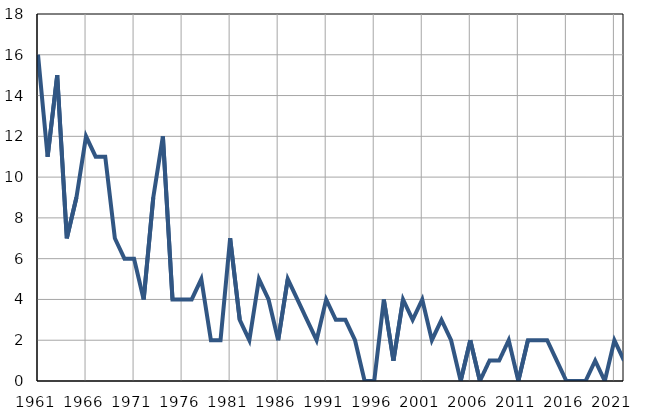
| Category | Infants
deaths |
|---|---|
| 1961.0 | 16 |
| 1962.0 | 11 |
| 1963.0 | 15 |
| 1964.0 | 7 |
| 1965.0 | 9 |
| 1966.0 | 12 |
| 1967.0 | 11 |
| 1968.0 | 11 |
| 1969.0 | 7 |
| 1970.0 | 6 |
| 1971.0 | 6 |
| 1972.0 | 4 |
| 1973.0 | 9 |
| 1974.0 | 12 |
| 1975.0 | 4 |
| 1976.0 | 4 |
| 1977.0 | 4 |
| 1978.0 | 5 |
| 1979.0 | 2 |
| 1980.0 | 2 |
| 1981.0 | 7 |
| 1982.0 | 3 |
| 1983.0 | 2 |
| 1984.0 | 5 |
| 1985.0 | 4 |
| 1986.0 | 2 |
| 1987.0 | 5 |
| 1988.0 | 4 |
| 1989.0 | 3 |
| 1990.0 | 2 |
| 1991.0 | 4 |
| 1992.0 | 3 |
| 1993.0 | 3 |
| 1994.0 | 2 |
| 1995.0 | 0 |
| 1996.0 | 0 |
| 1997.0 | 4 |
| 1998.0 | 1 |
| 1999.0 | 4 |
| 2000.0 | 3 |
| 2001.0 | 4 |
| 2002.0 | 2 |
| 2003.0 | 3 |
| 2004.0 | 2 |
| 2005.0 | 0 |
| 2006.0 | 2 |
| 2007.0 | 0 |
| 2008.0 | 1 |
| 2009.0 | 1 |
| 2010.0 | 2 |
| 2011.0 | 0 |
| 2012.0 | 2 |
| 2013.0 | 2 |
| 2014.0 | 2 |
| 2015.0 | 1 |
| 2016.0 | 0 |
| 2017.0 | 0 |
| 2018.0 | 0 |
| 2019.0 | 1 |
| 2020.0 | 0 |
| 2021.0 | 2 |
| 2022.0 | 1 |